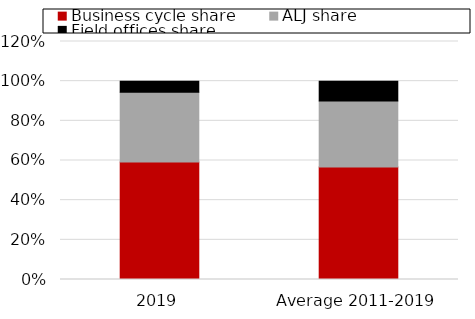
| Category | Business cycle share | ALJ share | Field offices share |
|---|---|---|---|
| 2019 | 0.593 | 0.352 | 0.056 |
| Average 2011-2019 | 0.567 | 0.333 | 0.1 |